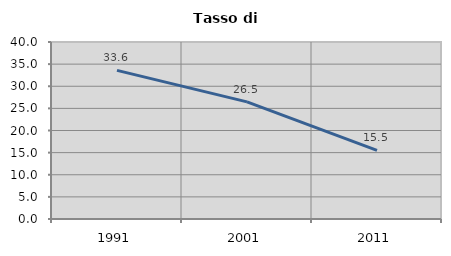
| Category | Tasso di disoccupazione   |
|---|---|
| 1991.0 | 33.585 |
| 2001.0 | 26.477 |
| 2011.0 | 15.492 |